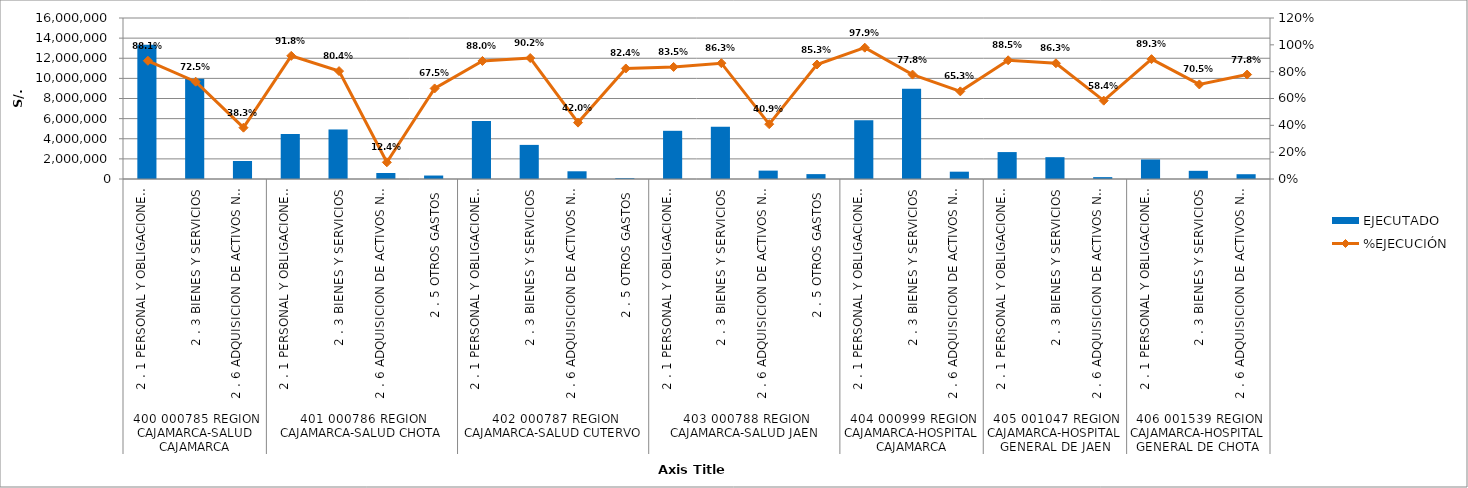
| Category | EJECUTADO |
|---|---|
| 0 | 13342896 |
| 1 | 9958104 |
| 2 | 1789776 |
| 3 | 4470216 |
| 4 | 4922304 |
| 5 | 594576 |
| 6 | 344592 |
| 7 | 5771376 |
| 8 | 3389640 |
| 9 | 766884 |
| 10 | 78336 |
| 11 | 4789332 |
| 12 | 5203740 |
| 13 | 832956 |
| 14 | 485160 |
| 15 | 5832324 |
| 16 | 8974836 |
| 17 | 727044 |
| 18 | 2676012 |
| 19 | 2169444 |
| 20 | 185892 |
| 21 | 1938216 |
| 22 | 812220 |
| 23 | 475236 |